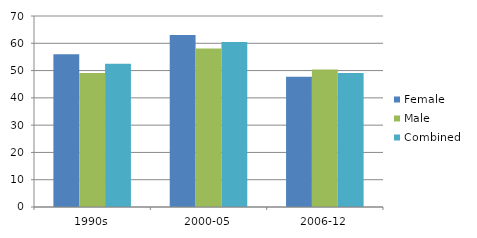
| Category | Female | Male | Combined |
|---|---|---|---|
| 1990s | 56 | 49.1 | 52.5 |
| 2000-05 | 63 | 58.1 | 60.5 |
| 2006-12 | 47.7 | 50.4 | 49.1 |